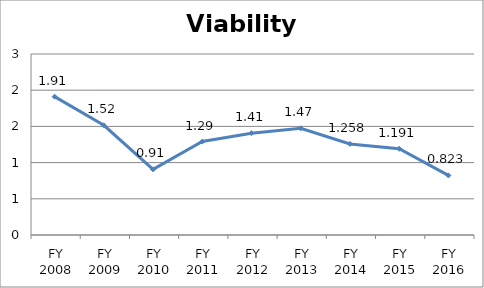
| Category | Viability ratio |
|---|---|
| FY 2016 | 0.823 |
| FY 2015 | 1.191 |
| FY 2014 | 1.258 |
| FY 2013 | 1.473 |
| FY 2012 | 1.406 |
| FY 2011 | 1.291 |
| FY 2010 | 0.907 |
| FY 2009 | 1.515 |
| FY 2008 | 1.911 |